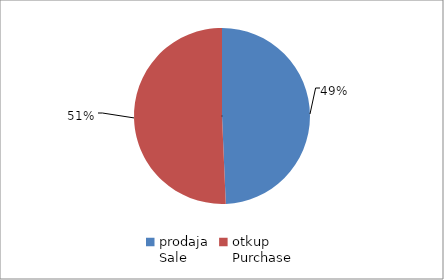
| Category | Series 0 |
|---|---|
| prodaja
Sale | 60805034.8 |
| otkup
Purchase | 62505980.7 |